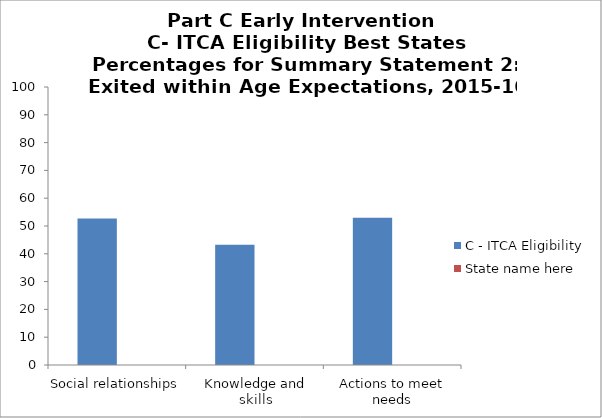
| Category | C - ITCA Eligibility | State name here |
|---|---|---|
| Social relationships | 52.7 |  |
| Knowledge and skills | 43.3 |  |
| Actions to meet needs | 53 |  |